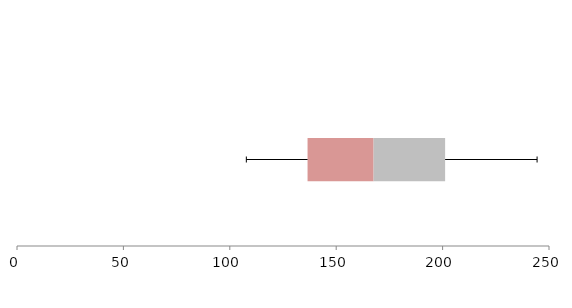
| Category | Series 1 | Series 2 | Series 3 |
|---|---|---|---|
| 0 | 136.54 | 31.024 | 33.623 |